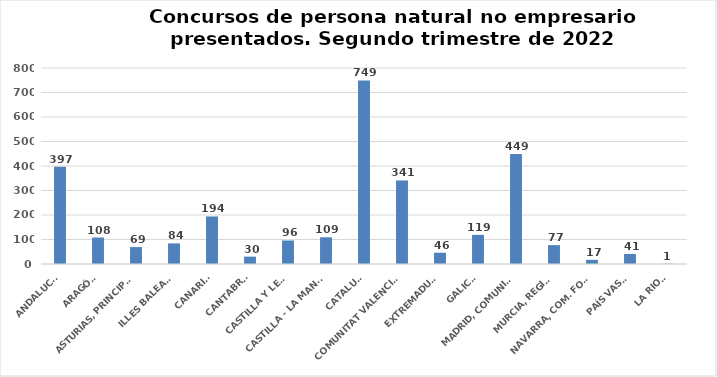
| Category | Series 0 |
|---|---|
| ANDALUCÍA | 397 |
| ARAGÓN | 108 |
| ASTURIAS, PRINCIPADO | 69 |
| ILLES BALEARS | 84 |
| CANARIAS | 194 |
| CANTABRIA | 30 |
| CASTILLA Y LEÓN | 96 |
| CASTILLA - LA MANCHA | 109 |
| CATALUÑA | 749 |
| COMUNITAT VALENCIANA | 341 |
| EXTREMADURA | 46 |
| GALICIA | 119 |
| MADRID, COMUNIDAD | 449 |
| MURCIA, REGIÓN | 77 |
| NAVARRA, COM. FORAL | 17 |
| PAÍS VASCO | 41 |
| LA RIOJA | 1 |